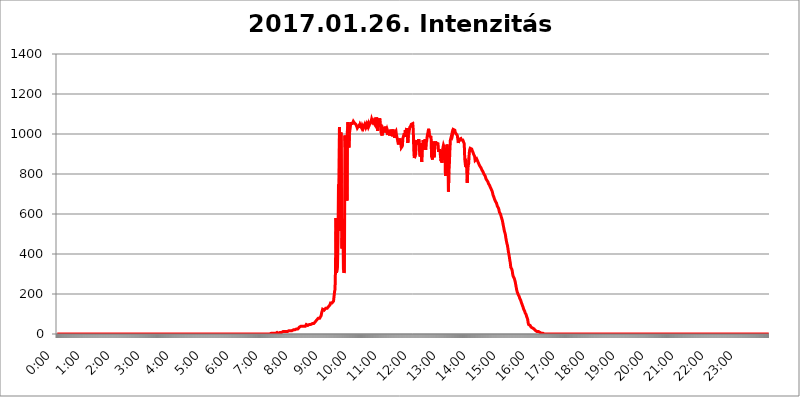
| Category | 2017.01.26. Intenzitás [W/m^2] |
|---|---|
| 0.0 | 0 |
| 0.0006944444444444445 | 0 |
| 0.001388888888888889 | 0 |
| 0.0020833333333333333 | 0 |
| 0.002777777777777778 | 0 |
| 0.003472222222222222 | 0 |
| 0.004166666666666667 | 0 |
| 0.004861111111111111 | 0 |
| 0.005555555555555556 | 0 |
| 0.0062499999999999995 | 0 |
| 0.006944444444444444 | 0 |
| 0.007638888888888889 | 0 |
| 0.008333333333333333 | 0 |
| 0.009027777777777779 | 0 |
| 0.009722222222222222 | 0 |
| 0.010416666666666666 | 0 |
| 0.011111111111111112 | 0 |
| 0.011805555555555555 | 0 |
| 0.012499999999999999 | 0 |
| 0.013194444444444444 | 0 |
| 0.013888888888888888 | 0 |
| 0.014583333333333332 | 0 |
| 0.015277777777777777 | 0 |
| 0.015972222222222224 | 0 |
| 0.016666666666666666 | 0 |
| 0.017361111111111112 | 0 |
| 0.018055555555555557 | 0 |
| 0.01875 | 0 |
| 0.019444444444444445 | 0 |
| 0.02013888888888889 | 0 |
| 0.020833333333333332 | 0 |
| 0.02152777777777778 | 0 |
| 0.022222222222222223 | 0 |
| 0.02291666666666667 | 0 |
| 0.02361111111111111 | 0 |
| 0.024305555555555556 | 0 |
| 0.024999999999999998 | 0 |
| 0.025694444444444447 | 0 |
| 0.02638888888888889 | 0 |
| 0.027083333333333334 | 0 |
| 0.027777777777777776 | 0 |
| 0.02847222222222222 | 0 |
| 0.029166666666666664 | 0 |
| 0.029861111111111113 | 0 |
| 0.030555555555555555 | 0 |
| 0.03125 | 0 |
| 0.03194444444444445 | 0 |
| 0.03263888888888889 | 0 |
| 0.03333333333333333 | 0 |
| 0.034027777777777775 | 0 |
| 0.034722222222222224 | 0 |
| 0.035416666666666666 | 0 |
| 0.036111111111111115 | 0 |
| 0.03680555555555556 | 0 |
| 0.0375 | 0 |
| 0.03819444444444444 | 0 |
| 0.03888888888888889 | 0 |
| 0.03958333333333333 | 0 |
| 0.04027777777777778 | 0 |
| 0.04097222222222222 | 0 |
| 0.041666666666666664 | 0 |
| 0.042361111111111106 | 0 |
| 0.04305555555555556 | 0 |
| 0.043750000000000004 | 0 |
| 0.044444444444444446 | 0 |
| 0.04513888888888889 | 0 |
| 0.04583333333333334 | 0 |
| 0.04652777777777778 | 0 |
| 0.04722222222222222 | 0 |
| 0.04791666666666666 | 0 |
| 0.04861111111111111 | 0 |
| 0.049305555555555554 | 0 |
| 0.049999999999999996 | 0 |
| 0.05069444444444445 | 0 |
| 0.051388888888888894 | 0 |
| 0.052083333333333336 | 0 |
| 0.05277777777777778 | 0 |
| 0.05347222222222222 | 0 |
| 0.05416666666666667 | 0 |
| 0.05486111111111111 | 0 |
| 0.05555555555555555 | 0 |
| 0.05625 | 0 |
| 0.05694444444444444 | 0 |
| 0.057638888888888885 | 0 |
| 0.05833333333333333 | 0 |
| 0.05902777777777778 | 0 |
| 0.059722222222222225 | 0 |
| 0.06041666666666667 | 0 |
| 0.061111111111111116 | 0 |
| 0.06180555555555556 | 0 |
| 0.0625 | 0 |
| 0.06319444444444444 | 0 |
| 0.06388888888888888 | 0 |
| 0.06458333333333334 | 0 |
| 0.06527777777777778 | 0 |
| 0.06597222222222222 | 0 |
| 0.06666666666666667 | 0 |
| 0.06736111111111111 | 0 |
| 0.06805555555555555 | 0 |
| 0.06874999999999999 | 0 |
| 0.06944444444444443 | 0 |
| 0.07013888888888889 | 0 |
| 0.07083333333333333 | 0 |
| 0.07152777777777779 | 0 |
| 0.07222222222222223 | 0 |
| 0.07291666666666667 | 0 |
| 0.07361111111111111 | 0 |
| 0.07430555555555556 | 0 |
| 0.075 | 0 |
| 0.07569444444444444 | 0 |
| 0.0763888888888889 | 0 |
| 0.07708333333333334 | 0 |
| 0.07777777777777778 | 0 |
| 0.07847222222222222 | 0 |
| 0.07916666666666666 | 0 |
| 0.0798611111111111 | 0 |
| 0.08055555555555556 | 0 |
| 0.08125 | 0 |
| 0.08194444444444444 | 0 |
| 0.08263888888888889 | 0 |
| 0.08333333333333333 | 0 |
| 0.08402777777777777 | 0 |
| 0.08472222222222221 | 0 |
| 0.08541666666666665 | 0 |
| 0.08611111111111112 | 0 |
| 0.08680555555555557 | 0 |
| 0.08750000000000001 | 0 |
| 0.08819444444444445 | 0 |
| 0.08888888888888889 | 0 |
| 0.08958333333333333 | 0 |
| 0.09027777777777778 | 0 |
| 0.09097222222222222 | 0 |
| 0.09166666666666667 | 0 |
| 0.09236111111111112 | 0 |
| 0.09305555555555556 | 0 |
| 0.09375 | 0 |
| 0.09444444444444444 | 0 |
| 0.09513888888888888 | 0 |
| 0.09583333333333333 | 0 |
| 0.09652777777777777 | 0 |
| 0.09722222222222222 | 0 |
| 0.09791666666666667 | 0 |
| 0.09861111111111111 | 0 |
| 0.09930555555555555 | 0 |
| 0.09999999999999999 | 0 |
| 0.10069444444444443 | 0 |
| 0.1013888888888889 | 0 |
| 0.10208333333333335 | 0 |
| 0.10277777777777779 | 0 |
| 0.10347222222222223 | 0 |
| 0.10416666666666667 | 0 |
| 0.10486111111111111 | 0 |
| 0.10555555555555556 | 0 |
| 0.10625 | 0 |
| 0.10694444444444444 | 0 |
| 0.1076388888888889 | 0 |
| 0.10833333333333334 | 0 |
| 0.10902777777777778 | 0 |
| 0.10972222222222222 | 0 |
| 0.1111111111111111 | 0 |
| 0.11180555555555556 | 0 |
| 0.11180555555555556 | 0 |
| 0.1125 | 0 |
| 0.11319444444444444 | 0 |
| 0.11388888888888889 | 0 |
| 0.11458333333333333 | 0 |
| 0.11527777777777777 | 0 |
| 0.11597222222222221 | 0 |
| 0.11666666666666665 | 0 |
| 0.1173611111111111 | 0 |
| 0.11805555555555557 | 0 |
| 0.11944444444444445 | 0 |
| 0.12013888888888889 | 0 |
| 0.12083333333333333 | 0 |
| 0.12152777777777778 | 0 |
| 0.12222222222222223 | 0 |
| 0.12291666666666667 | 0 |
| 0.12291666666666667 | 0 |
| 0.12361111111111112 | 0 |
| 0.12430555555555556 | 0 |
| 0.125 | 0 |
| 0.12569444444444444 | 0 |
| 0.12638888888888888 | 0 |
| 0.12708333333333333 | 0 |
| 0.16875 | 0 |
| 0.12847222222222224 | 0 |
| 0.12916666666666668 | 0 |
| 0.12986111111111112 | 0 |
| 0.13055555555555556 | 0 |
| 0.13125 | 0 |
| 0.13194444444444445 | 0 |
| 0.1326388888888889 | 0 |
| 0.13333333333333333 | 0 |
| 0.13402777777777777 | 0 |
| 0.13402777777777777 | 0 |
| 0.13472222222222222 | 0 |
| 0.13541666666666666 | 0 |
| 0.1361111111111111 | 0 |
| 0.13749999999999998 | 0 |
| 0.13819444444444443 | 0 |
| 0.1388888888888889 | 0 |
| 0.13958333333333334 | 0 |
| 0.14027777777777778 | 0 |
| 0.14097222222222222 | 0 |
| 0.14166666666666666 | 0 |
| 0.1423611111111111 | 0 |
| 0.14305555555555557 | 0 |
| 0.14375000000000002 | 0 |
| 0.14444444444444446 | 0 |
| 0.1451388888888889 | 0 |
| 0.1451388888888889 | 0 |
| 0.14652777777777778 | 0 |
| 0.14722222222222223 | 0 |
| 0.14791666666666667 | 0 |
| 0.1486111111111111 | 0 |
| 0.14930555555555555 | 0 |
| 0.15 | 0 |
| 0.15069444444444444 | 0 |
| 0.15138888888888888 | 0 |
| 0.15208333333333332 | 0 |
| 0.15277777777777776 | 0 |
| 0.15347222222222223 | 0 |
| 0.15416666666666667 | 0 |
| 0.15486111111111112 | 0 |
| 0.15555555555555556 | 0 |
| 0.15625 | 0 |
| 0.15694444444444444 | 0 |
| 0.15763888888888888 | 0 |
| 0.15833333333333333 | 0 |
| 0.15902777777777777 | 0 |
| 0.15972222222222224 | 0 |
| 0.16041666666666668 | 0 |
| 0.16111111111111112 | 0 |
| 0.16180555555555556 | 0 |
| 0.1625 | 0 |
| 0.16319444444444445 | 0 |
| 0.1638888888888889 | 0 |
| 0.16458333333333333 | 0 |
| 0.16527777777777777 | 0 |
| 0.16597222222222222 | 0 |
| 0.16666666666666666 | 0 |
| 0.1673611111111111 | 0 |
| 0.16805555555555554 | 0 |
| 0.16874999999999998 | 0 |
| 0.16944444444444443 | 0 |
| 0.17013888888888887 | 0 |
| 0.1708333333333333 | 0 |
| 0.17152777777777775 | 0 |
| 0.17222222222222225 | 0 |
| 0.1729166666666667 | 0 |
| 0.17361111111111113 | 0 |
| 0.17430555555555557 | 0 |
| 0.17500000000000002 | 0 |
| 0.17569444444444446 | 0 |
| 0.1763888888888889 | 0 |
| 0.17708333333333334 | 0 |
| 0.17777777777777778 | 0 |
| 0.17847222222222223 | 0 |
| 0.17916666666666667 | 0 |
| 0.1798611111111111 | 0 |
| 0.18055555555555555 | 0 |
| 0.18125 | 0 |
| 0.18194444444444444 | 0 |
| 0.1826388888888889 | 0 |
| 0.18333333333333335 | 0 |
| 0.1840277777777778 | 0 |
| 0.18472222222222223 | 0 |
| 0.18541666666666667 | 0 |
| 0.18611111111111112 | 0 |
| 0.18680555555555556 | 0 |
| 0.1875 | 0 |
| 0.18819444444444444 | 0 |
| 0.18888888888888888 | 0 |
| 0.18958333333333333 | 0 |
| 0.19027777777777777 | 0 |
| 0.1909722222222222 | 0 |
| 0.19166666666666665 | 0 |
| 0.19236111111111112 | 0 |
| 0.19305555555555554 | 0 |
| 0.19375 | 0 |
| 0.19444444444444445 | 0 |
| 0.1951388888888889 | 0 |
| 0.19583333333333333 | 0 |
| 0.19652777777777777 | 0 |
| 0.19722222222222222 | 0 |
| 0.19791666666666666 | 0 |
| 0.1986111111111111 | 0 |
| 0.19930555555555554 | 0 |
| 0.19999999999999998 | 0 |
| 0.20069444444444443 | 0 |
| 0.20138888888888887 | 0 |
| 0.2020833333333333 | 0 |
| 0.2027777777777778 | 0 |
| 0.2034722222222222 | 0 |
| 0.2041666666666667 | 0 |
| 0.20486111111111113 | 0 |
| 0.20555555555555557 | 0 |
| 0.20625000000000002 | 0 |
| 0.20694444444444446 | 0 |
| 0.2076388888888889 | 0 |
| 0.20833333333333334 | 0 |
| 0.20902777777777778 | 0 |
| 0.20972222222222223 | 0 |
| 0.21041666666666667 | 0 |
| 0.2111111111111111 | 0 |
| 0.21180555555555555 | 0 |
| 0.2125 | 0 |
| 0.21319444444444444 | 0 |
| 0.2138888888888889 | 0 |
| 0.21458333333333335 | 0 |
| 0.2152777777777778 | 0 |
| 0.21597222222222223 | 0 |
| 0.21666666666666667 | 0 |
| 0.21736111111111112 | 0 |
| 0.21805555555555556 | 0 |
| 0.21875 | 0 |
| 0.21944444444444444 | 0 |
| 0.22013888888888888 | 0 |
| 0.22083333333333333 | 0 |
| 0.22152777777777777 | 0 |
| 0.2222222222222222 | 0 |
| 0.22291666666666665 | 0 |
| 0.2236111111111111 | 0 |
| 0.22430555555555556 | 0 |
| 0.225 | 0 |
| 0.22569444444444445 | 0 |
| 0.2263888888888889 | 0 |
| 0.22708333333333333 | 0 |
| 0.22777777777777777 | 0 |
| 0.22847222222222222 | 0 |
| 0.22916666666666666 | 0 |
| 0.2298611111111111 | 0 |
| 0.23055555555555554 | 0 |
| 0.23124999999999998 | 0 |
| 0.23194444444444443 | 0 |
| 0.23263888888888887 | 0 |
| 0.2333333333333333 | 0 |
| 0.2340277777777778 | 0 |
| 0.2347222222222222 | 0 |
| 0.2354166666666667 | 0 |
| 0.23611111111111113 | 0 |
| 0.23680555555555557 | 0 |
| 0.23750000000000002 | 0 |
| 0.23819444444444446 | 0 |
| 0.2388888888888889 | 0 |
| 0.23958333333333334 | 0 |
| 0.24027777777777778 | 0 |
| 0.24097222222222223 | 0 |
| 0.24166666666666667 | 0 |
| 0.2423611111111111 | 0 |
| 0.24305555555555555 | 0 |
| 0.24375 | 0 |
| 0.24444444444444446 | 0 |
| 0.24513888888888888 | 0 |
| 0.24583333333333335 | 0 |
| 0.2465277777777778 | 0 |
| 0.24722222222222223 | 0 |
| 0.24791666666666667 | 0 |
| 0.24861111111111112 | 0 |
| 0.24930555555555556 | 0 |
| 0.25 | 0 |
| 0.25069444444444444 | 0 |
| 0.2513888888888889 | 0 |
| 0.2520833333333333 | 0 |
| 0.25277777777777777 | 0 |
| 0.2534722222222222 | 0 |
| 0.25416666666666665 | 0 |
| 0.2548611111111111 | 0 |
| 0.2555555555555556 | 0 |
| 0.25625000000000003 | 0 |
| 0.2569444444444445 | 0 |
| 0.2576388888888889 | 0 |
| 0.25833333333333336 | 0 |
| 0.2590277777777778 | 0 |
| 0.25972222222222224 | 0 |
| 0.2604166666666667 | 0 |
| 0.2611111111111111 | 0 |
| 0.26180555555555557 | 0 |
| 0.2625 | 0 |
| 0.26319444444444445 | 0 |
| 0.2638888888888889 | 0 |
| 0.26458333333333334 | 0 |
| 0.2652777777777778 | 0 |
| 0.2659722222222222 | 0 |
| 0.26666666666666666 | 0 |
| 0.2673611111111111 | 0 |
| 0.26805555555555555 | 0 |
| 0.26875 | 0 |
| 0.26944444444444443 | 0 |
| 0.2701388888888889 | 0 |
| 0.2708333333333333 | 0 |
| 0.27152777777777776 | 0 |
| 0.2722222222222222 | 0 |
| 0.27291666666666664 | 0 |
| 0.2736111111111111 | 0 |
| 0.2743055555555555 | 0 |
| 0.27499999999999997 | 0 |
| 0.27569444444444446 | 0 |
| 0.27638888888888885 | 0 |
| 0.27708333333333335 | 0 |
| 0.2777777777777778 | 0 |
| 0.27847222222222223 | 0 |
| 0.2791666666666667 | 0 |
| 0.2798611111111111 | 0 |
| 0.28055555555555556 | 0 |
| 0.28125 | 0 |
| 0.28194444444444444 | 0 |
| 0.2826388888888889 | 0 |
| 0.2833333333333333 | 0 |
| 0.28402777777777777 | 0 |
| 0.2847222222222222 | 0 |
| 0.28541666666666665 | 0 |
| 0.28611111111111115 | 0 |
| 0.28680555555555554 | 0 |
| 0.28750000000000003 | 0 |
| 0.2881944444444445 | 0 |
| 0.2888888888888889 | 0 |
| 0.28958333333333336 | 0 |
| 0.2902777777777778 | 0 |
| 0.29097222222222224 | 0 |
| 0.2916666666666667 | 0 |
| 0.2923611111111111 | 0 |
| 0.29305555555555557 | 0 |
| 0.29375 | 0 |
| 0.29444444444444445 | 0 |
| 0.2951388888888889 | 0 |
| 0.29583333333333334 | 0 |
| 0.2965277777777778 | 0 |
| 0.2972222222222222 | 0 |
| 0.29791666666666666 | 0 |
| 0.2986111111111111 | 0 |
| 0.29930555555555555 | 0 |
| 0.3 | 3.525 |
| 0.30069444444444443 | 0 |
| 0.3013888888888889 | 3.525 |
| 0.3020833333333333 | 3.525 |
| 0.30277777777777776 | 3.525 |
| 0.3034722222222222 | 3.525 |
| 0.30416666666666664 | 3.525 |
| 0.3048611111111111 | 3.525 |
| 0.3055555555555555 | 3.525 |
| 0.30624999999999997 | 3.525 |
| 0.3069444444444444 | 3.525 |
| 0.3076388888888889 | 3.525 |
| 0.30833333333333335 | 7.887 |
| 0.3090277777777778 | 7.887 |
| 0.30972222222222223 | 3.525 |
| 0.3104166666666667 | 3.525 |
| 0.3111111111111111 | 7.887 |
| 0.31180555555555556 | 7.887 |
| 0.3125 | 7.887 |
| 0.31319444444444444 | 7.887 |
| 0.3138888888888889 | 7.887 |
| 0.3145833333333333 | 7.887 |
| 0.31527777777777777 | 12.257 |
| 0.3159722222222222 | 12.257 |
| 0.31666666666666665 | 12.257 |
| 0.31736111111111115 | 12.257 |
| 0.31805555555555554 | 12.257 |
| 0.31875000000000003 | 12.257 |
| 0.3194444444444445 | 12.257 |
| 0.3201388888888889 | 12.257 |
| 0.32083333333333336 | 12.257 |
| 0.3215277777777778 | 12.257 |
| 0.32222222222222224 | 12.257 |
| 0.3229166666666667 | 12.257 |
| 0.3236111111111111 | 12.257 |
| 0.32430555555555557 | 12.257 |
| 0.325 | 16.636 |
| 0.32569444444444445 | 16.636 |
| 0.3263888888888889 | 16.636 |
| 0.32708333333333334 | 16.636 |
| 0.3277777777777778 | 16.636 |
| 0.3284722222222222 | 16.636 |
| 0.32916666666666666 | 16.636 |
| 0.3298611111111111 | 16.636 |
| 0.33055555555555555 | 21.024 |
| 0.33125 | 21.024 |
| 0.33194444444444443 | 21.024 |
| 0.3326388888888889 | 21.024 |
| 0.3333333333333333 | 21.024 |
| 0.3340277777777778 | 21.024 |
| 0.3347222222222222 | 21.024 |
| 0.3354166666666667 | 25.419 |
| 0.3361111111111111 | 25.419 |
| 0.3368055555555556 | 25.419 |
| 0.33749999999999997 | 25.419 |
| 0.33819444444444446 | 29.823 |
| 0.33888888888888885 | 29.823 |
| 0.33958333333333335 | 34.234 |
| 0.34027777777777773 | 34.234 |
| 0.34097222222222223 | 38.653 |
| 0.3416666666666666 | 38.653 |
| 0.3423611111111111 | 38.653 |
| 0.3430555555555555 | 38.653 |
| 0.34375 | 38.653 |
| 0.3444444444444445 | 38.653 |
| 0.3451388888888889 | 38.653 |
| 0.3458333333333334 | 38.653 |
| 0.34652777777777777 | 38.653 |
| 0.34722222222222227 | 38.653 |
| 0.34791666666666665 | 38.653 |
| 0.34861111111111115 | 43.079 |
| 0.34930555555555554 | 47.511 |
| 0.35000000000000003 | 47.511 |
| 0.3506944444444444 | 43.079 |
| 0.3513888888888889 | 43.079 |
| 0.3520833333333333 | 43.079 |
| 0.3527777777777778 | 47.511 |
| 0.3534722222222222 | 47.511 |
| 0.3541666666666667 | 47.511 |
| 0.3548611111111111 | 47.511 |
| 0.35555555555555557 | 47.511 |
| 0.35625 | 51.951 |
| 0.35694444444444445 | 51.951 |
| 0.3576388888888889 | 51.951 |
| 0.35833333333333334 | 51.951 |
| 0.3590277777777778 | 51.951 |
| 0.3597222222222222 | 51.951 |
| 0.36041666666666666 | 56.398 |
| 0.3611111111111111 | 56.398 |
| 0.36180555555555555 | 60.85 |
| 0.3625 | 60.85 |
| 0.36319444444444443 | 65.31 |
| 0.3638888888888889 | 69.775 |
| 0.3645833333333333 | 74.246 |
| 0.3652777777777778 | 74.246 |
| 0.3659722222222222 | 78.722 |
| 0.3666666666666667 | 83.205 |
| 0.3673611111111111 | 83.205 |
| 0.3680555555555556 | 78.722 |
| 0.36874999999999997 | 83.205 |
| 0.36944444444444446 | 83.205 |
| 0.37013888888888885 | 92.184 |
| 0.37083333333333335 | 105.69 |
| 0.37152777777777773 | 114.716 |
| 0.37222222222222223 | 123.758 |
| 0.3729166666666666 | 128.284 |
| 0.3736111111111111 | 123.758 |
| 0.3743055555555555 | 119.235 |
| 0.375 | 119.235 |
| 0.3756944444444445 | 123.758 |
| 0.3763888888888889 | 128.284 |
| 0.3770833333333334 | 128.284 |
| 0.37777777777777777 | 128.284 |
| 0.37847222222222227 | 128.284 |
| 0.37916666666666665 | 123.758 |
| 0.37986111111111115 | 128.284 |
| 0.38055555555555554 | 137.347 |
| 0.38125000000000003 | 141.884 |
| 0.3819444444444444 | 141.884 |
| 0.3826388888888889 | 146.423 |
| 0.3833333333333333 | 155.509 |
| 0.3840277777777778 | 155.509 |
| 0.3847222222222222 | 155.509 |
| 0.3854166666666667 | 155.509 |
| 0.3861111111111111 | 155.509 |
| 0.38680555555555557 | 160.056 |
| 0.3875 | 164.605 |
| 0.38819444444444445 | 187.378 |
| 0.3888888888888889 | 210.182 |
| 0.38958333333333334 | 223.873 |
| 0.3902777777777778 | 324.052 |
| 0.3909722222222222 | 579.542 |
| 0.39166666666666666 | 305.898 |
| 0.3923611111111111 | 310.44 |
| 0.39305555555555555 | 342.162 |
| 0.39375 | 462.786 |
| 0.39444444444444443 | 747.834 |
| 0.3951388888888889 | 634.105 |
| 0.3958333333333333 | 1033.537 |
| 0.3965277777777778 | 515.223 |
| 0.3972222222222222 | 545.416 |
| 0.3979166666666667 | 1007.383 |
| 0.3986111111111111 | 751.803 |
| 0.3993055555555556 | 427.39 |
| 0.39999999999999997 | 575.299 |
| 0.40069444444444446 | 536.82 |
| 0.40138888888888885 | 324.052 |
| 0.40208333333333335 | 305.898 |
| 0.40277777777777773 | 314.98 |
| 0.40347222222222223 | 992.448 |
| 0.4041666666666666 | 928.819 |
| 0.4048611111111111 | 917.534 |
| 0.4055555555555555 | 970.034 |
| 0.40625 | 667.123 |
| 0.4069444444444445 | 1014.852 |
| 0.4076388888888889 | 1059.756 |
| 0.4083333333333334 | 1029.798 |
| 0.40902777777777777 | 932.576 |
| 0.40972222222222227 | 999.916 |
| 0.41041666666666665 | 1018.587 |
| 0.41111111111111115 | 1037.277 |
| 0.41180555555555554 | 1052.255 |
| 0.41250000000000003 | 1052.255 |
| 0.4131944444444444 | 1052.255 |
| 0.4138888888888889 | 1052.255 |
| 0.4145833333333333 | 1056.004 |
| 0.4152777777777778 | 1063.51 |
| 0.4159722222222222 | 1067.267 |
| 0.4166666666666667 | 1056.004 |
| 0.4173611111111111 | 1052.255 |
| 0.41805555555555557 | 1052.255 |
| 0.41875 | 1048.508 |
| 0.41944444444444445 | 1044.762 |
| 0.4201388888888889 | 1037.277 |
| 0.42083333333333334 | 1029.798 |
| 0.4215277777777778 | 1033.537 |
| 0.4222222222222222 | 1037.277 |
| 0.42291666666666666 | 1041.019 |
| 0.4236111111111111 | 1044.762 |
| 0.42430555555555555 | 1029.798 |
| 0.425 | 1044.762 |
| 0.42569444444444443 | 1048.508 |
| 0.4263888888888889 | 1044.762 |
| 0.4270833333333333 | 1029.798 |
| 0.4277777777777778 | 1041.019 |
| 0.4284722222222222 | 1037.277 |
| 0.4291666666666667 | 1029.798 |
| 0.4298611111111111 | 1037.277 |
| 0.4305555555555556 | 1041.019 |
| 0.43124999999999997 | 1048.508 |
| 0.43194444444444446 | 1044.762 |
| 0.43263888888888885 | 1033.537 |
| 0.43333333333333335 | 1033.537 |
| 0.43402777777777773 | 1048.508 |
| 0.43472222222222223 | 1041.019 |
| 0.4354166666666666 | 1041.019 |
| 0.4361111111111111 | 1052.255 |
| 0.4368055555555555 | 1037.277 |
| 0.4375 | 1037.277 |
| 0.4381944444444445 | 1048.508 |
| 0.4388888888888889 | 1044.762 |
| 0.4395833333333334 | 1044.762 |
| 0.44027777777777777 | 1063.51 |
| 0.44097222222222227 | 1074.789 |
| 0.44166666666666665 | 1074.789 |
| 0.44236111111111115 | 1059.756 |
| 0.44305555555555554 | 1059.756 |
| 0.44375000000000003 | 1067.267 |
| 0.4444444444444444 | 1052.255 |
| 0.4451388888888889 | 1052.255 |
| 0.4458333333333333 | 1044.762 |
| 0.4465277777777778 | 1078.555 |
| 0.4472222222222222 | 1044.762 |
| 0.4479166666666667 | 1082.324 |
| 0.4486111111111111 | 1056.004 |
| 0.44930555555555557 | 1014.852 |
| 0.45 | 1056.004 |
| 0.45069444444444445 | 1044.762 |
| 0.4513888888888889 | 1063.51 |
| 0.45208333333333334 | 1078.555 |
| 0.4527777777777778 | 1067.267 |
| 0.4534722222222222 | 1037.277 |
| 0.45416666666666666 | 1007.383 |
| 0.4548611111111111 | 1007.383 |
| 0.45555555555555555 | 992.448 |
| 0.45625 | 1011.118 |
| 0.45694444444444443 | 1026.06 |
| 0.4576388888888889 | 1022.323 |
| 0.4583333333333333 | 1014.852 |
| 0.4590277777777778 | 1007.383 |
| 0.4597222222222222 | 1026.06 |
| 0.4604166666666667 | 1037.277 |
| 0.4611111111111111 | 1033.537 |
| 0.4618055555555556 | 1018.587 |
| 0.46249999999999997 | 1026.06 |
| 0.46319444444444446 | 1018.587 |
| 0.46388888888888885 | 996.182 |
| 0.46458333333333335 | 1014.852 |
| 0.46527777777777773 | 1003.65 |
| 0.46597222222222223 | 992.448 |
| 0.4666666666666666 | 996.182 |
| 0.4673611111111111 | 1014.852 |
| 0.4680555555555555 | 1022.323 |
| 0.46875 | 1007.383 |
| 0.4694444444444445 | 1007.383 |
| 0.4701388888888889 | 988.714 |
| 0.4708333333333334 | 1022.323 |
| 0.47152777777777777 | 999.916 |
| 0.47222222222222227 | 1011.118 |
| 0.47291666666666665 | 981.244 |
| 0.47361111111111115 | 1007.383 |
| 0.47430555555555554 | 1011.118 |
| 0.47500000000000003 | 1014.852 |
| 0.4756944444444444 | 996.182 |
| 0.4763888888888889 | 999.916 |
| 0.4770833333333333 | 973.772 |
| 0.4777777777777778 | 970.034 |
| 0.4784722222222222 | 947.58 |
| 0.4791666666666667 | 970.034 |
| 0.4798611111111111 | 962.555 |
| 0.48055555555555557 | 977.508 |
| 0.48125 | 955.071 |
| 0.48194444444444445 | 962.555 |
| 0.4826388888888889 | 932.576 |
| 0.48333333333333334 | 936.33 |
| 0.4840277777777778 | 940.082 |
| 0.4847222222222222 | 977.508 |
| 0.48541666666666666 | 977.508 |
| 0.4861111111111111 | 973.772 |
| 0.48680555555555555 | 1003.65 |
| 0.4875 | 984.98 |
| 0.48819444444444443 | 1018.587 |
| 0.4888888888888889 | 1007.383 |
| 0.4895833333333333 | 1007.383 |
| 0.4902777777777778 | 1029.798 |
| 0.4909722222222222 | 1011.118 |
| 0.4916666666666667 | 955.071 |
| 0.4923611111111111 | 996.182 |
| 0.4930555555555556 | 1003.65 |
| 0.49374999999999997 | 1018.587 |
| 0.49444444444444446 | 1033.537 |
| 0.49513888888888885 | 1037.277 |
| 0.49583333333333335 | 1041.019 |
| 0.49652777777777773 | 1048.508 |
| 0.49722222222222223 | 1052.255 |
| 0.4979166666666666 | 1052.255 |
| 0.4986111111111111 | 1052.255 |
| 0.4993055555555555 | 1022.323 |
| 0.5 | 925.06 |
| 0.5006944444444444 | 879.719 |
| 0.5013888888888889 | 883.516 |
| 0.5020833333333333 | 891.099 |
| 0.5027777777777778 | 898.668 |
| 0.5034722222222222 | 955.071 |
| 0.5041666666666667 | 970.034 |
| 0.5048611111111111 | 955.071 |
| 0.5055555555555555 | 947.58 |
| 0.50625 | 943.832 |
| 0.5069444444444444 | 973.772 |
| 0.5076388888888889 | 958.814 |
| 0.5083333333333333 | 902.447 |
| 0.5090277777777777 | 887.309 |
| 0.5097222222222222 | 955.071 |
| 0.5104166666666666 | 928.819 |
| 0.5111111111111112 | 860.676 |
| 0.5118055555555555 | 917.534 |
| 0.5125000000000001 | 925.06 |
| 0.5131944444444444 | 970.034 |
| 0.513888888888889 | 955.071 |
| 0.5145833333333333 | 943.832 |
| 0.5152777777777778 | 958.814 |
| 0.5159722222222222 | 973.772 |
| 0.5166666666666667 | 921.298 |
| 0.517361111111111 | 955.071 |
| 0.5180555555555556 | 962.555 |
| 0.5187499999999999 | 984.98 |
| 0.5194444444444445 | 999.916 |
| 0.5201388888888888 | 1011.118 |
| 0.5208333333333334 | 1026.06 |
| 0.5215277777777778 | 1026.06 |
| 0.5222222222222223 | 988.714 |
| 0.5229166666666667 | 992.448 |
| 0.5236111111111111 | 988.714 |
| 0.5243055555555556 | 984.98 |
| 0.525 | 887.309 |
| 0.5256944444444445 | 887.309 |
| 0.5263888888888889 | 872.114 |
| 0.5270833333333333 | 955.071 |
| 0.5277777777777778 | 962.555 |
| 0.5284722222222222 | 883.516 |
| 0.5291666666666667 | 887.309 |
| 0.5298611111111111 | 951.327 |
| 0.5305555555555556 | 962.555 |
| 0.53125 | 947.58 |
| 0.5319444444444444 | 955.071 |
| 0.5326388888888889 | 958.814 |
| 0.5333333333333333 | 958.814 |
| 0.5340277777777778 | 951.327 |
| 0.5347222222222222 | 917.534 |
| 0.5354166666666667 | 921.298 |
| 0.5361111111111111 | 921.298 |
| 0.5368055555555555 | 917.534 |
| 0.5375 | 887.309 |
| 0.5381944444444444 | 864.493 |
| 0.5388888888888889 | 875.918 |
| 0.5395833333333333 | 856.855 |
| 0.5402777777777777 | 913.766 |
| 0.5409722222222222 | 932.576 |
| 0.5416666666666666 | 943.832 |
| 0.5423611111111112 | 947.58 |
| 0.5430555555555555 | 928.819 |
| 0.5437500000000001 | 917.534 |
| 0.5444444444444444 | 791.169 |
| 0.545138888888889 | 894.885 |
| 0.5458333333333333 | 909.996 |
| 0.5465277777777778 | 947.58 |
| 0.5472222222222222 | 932.576 |
| 0.5479166666666667 | 917.534 |
| 0.548611111111111 | 711.832 |
| 0.5493055555555556 | 806.757 |
| 0.5499999999999999 | 853.029 |
| 0.5506944444444445 | 921.298 |
| 0.5513888888888888 | 970.034 |
| 0.5520833333333334 | 966.295 |
| 0.5527777777777778 | 988.714 |
| 0.5534722222222223 | 999.916 |
| 0.5541666666666667 | 992.448 |
| 0.5548611111111111 | 1003.65 |
| 0.5555555555555556 | 1022.323 |
| 0.55625 | 1022.323 |
| 0.5569444444444445 | 1022.323 |
| 0.5576388888888889 | 1018.587 |
| 0.5583333333333333 | 1007.383 |
| 0.5590277777777778 | 1003.65 |
| 0.5597222222222222 | 999.916 |
| 0.5604166666666667 | 996.182 |
| 0.5611111111111111 | 992.448 |
| 0.5618055555555556 | 988.714 |
| 0.5625 | 955.071 |
| 0.5631944444444444 | 966.295 |
| 0.5638888888888889 | 973.772 |
| 0.5645833333333333 | 970.034 |
| 0.5652777777777778 | 973.772 |
| 0.5659722222222222 | 977.508 |
| 0.5666666666666667 | 970.034 |
| 0.5673611111111111 | 970.034 |
| 0.5680555555555555 | 970.034 |
| 0.56875 | 970.034 |
| 0.5694444444444444 | 966.295 |
| 0.5701388888888889 | 970.034 |
| 0.5708333333333333 | 951.327 |
| 0.5715277777777777 | 875.918 |
| 0.5722222222222222 | 853.029 |
| 0.5729166666666666 | 856.855 |
| 0.5736111111111112 | 860.676 |
| 0.5743055555555555 | 822.26 |
| 0.5750000000000001 | 755.766 |
| 0.5756944444444444 | 806.757 |
| 0.576388888888889 | 841.526 |
| 0.5770833333333333 | 853.029 |
| 0.5777777777777778 | 902.447 |
| 0.5784722222222222 | 921.298 |
| 0.5791666666666667 | 928.819 |
| 0.579861111111111 | 925.06 |
| 0.5805555555555556 | 925.06 |
| 0.5812499999999999 | 925.06 |
| 0.5819444444444445 | 917.534 |
| 0.5826388888888888 | 917.534 |
| 0.5833333333333334 | 906.223 |
| 0.5840277777777778 | 898.668 |
| 0.5847222222222223 | 894.885 |
| 0.5854166666666667 | 887.309 |
| 0.5861111111111111 | 868.305 |
| 0.5868055555555556 | 864.493 |
| 0.5875 | 872.114 |
| 0.5881944444444445 | 875.918 |
| 0.5888888888888889 | 872.114 |
| 0.5895833333333333 | 864.493 |
| 0.5902777777777778 | 860.676 |
| 0.5909722222222222 | 853.029 |
| 0.5916666666666667 | 849.199 |
| 0.5923611111111111 | 841.526 |
| 0.5930555555555556 | 837.682 |
| 0.59375 | 837.682 |
| 0.5944444444444444 | 829.981 |
| 0.5951388888888889 | 826.123 |
| 0.5958333333333333 | 818.392 |
| 0.5965277777777778 | 814.519 |
| 0.5972222222222222 | 810.641 |
| 0.5979166666666667 | 802.868 |
| 0.5986111111111111 | 798.974 |
| 0.5993055555555555 | 802.868 |
| 0.6 | 791.169 |
| 0.6006944444444444 | 783.342 |
| 0.6013888888888889 | 775.492 |
| 0.6020833333333333 | 771.559 |
| 0.6027777777777777 | 767.62 |
| 0.6034722222222222 | 767.62 |
| 0.6041666666666666 | 759.723 |
| 0.6048611111111112 | 751.803 |
| 0.6055555555555555 | 751.803 |
| 0.6062500000000001 | 743.859 |
| 0.6069444444444444 | 739.877 |
| 0.607638888888889 | 731.896 |
| 0.6083333333333333 | 731.896 |
| 0.6090277777777778 | 727.896 |
| 0.6097222222222222 | 715.858 |
| 0.6104166666666667 | 707.8 |
| 0.611111111111111 | 695.666 |
| 0.6118055555555556 | 691.608 |
| 0.6124999999999999 | 683.473 |
| 0.6131944444444445 | 675.311 |
| 0.6138888888888888 | 671.22 |
| 0.6145833333333334 | 663.019 |
| 0.6152777777777778 | 658.909 |
| 0.6159722222222223 | 654.791 |
| 0.6166666666666667 | 646.537 |
| 0.6173611111111111 | 638.256 |
| 0.6180555555555556 | 634.105 |
| 0.61875 | 629.948 |
| 0.6194444444444445 | 621.613 |
| 0.6201388888888889 | 609.062 |
| 0.6208333333333333 | 604.864 |
| 0.6215277777777778 | 600.661 |
| 0.6222222222222222 | 592.233 |
| 0.6229166666666667 | 583.779 |
| 0.6236111111111111 | 575.299 |
| 0.6243055555555556 | 566.793 |
| 0.625 | 553.986 |
| 0.6256944444444444 | 541.121 |
| 0.6263888888888889 | 528.2 |
| 0.6270833333333333 | 515.223 |
| 0.6277777777777778 | 506.542 |
| 0.6284722222222222 | 497.836 |
| 0.6291666666666667 | 480.356 |
| 0.6298611111111111 | 467.187 |
| 0.6305555555555555 | 453.968 |
| 0.63125 | 445.129 |
| 0.6319444444444444 | 431.833 |
| 0.6326388888888889 | 414.035 |
| 0.6333333333333333 | 400.638 |
| 0.6340277777777777 | 387.202 |
| 0.6347222222222222 | 369.23 |
| 0.6354166666666666 | 355.712 |
| 0.6361111111111112 | 333.113 |
| 0.6368055555555555 | 328.584 |
| 0.6375000000000001 | 324.052 |
| 0.6381944444444444 | 314.98 |
| 0.638888888888889 | 296.808 |
| 0.6395833333333333 | 287.709 |
| 0.6402777777777778 | 283.156 |
| 0.6409722222222222 | 278.603 |
| 0.6416666666666667 | 269.49 |
| 0.642361111111111 | 260.373 |
| 0.6430555555555556 | 246.689 |
| 0.6437499999999999 | 233 |
| 0.6444444444444445 | 219.309 |
| 0.6451388888888888 | 210.182 |
| 0.6458333333333334 | 205.62 |
| 0.6465277777777778 | 196.497 |
| 0.6472222222222223 | 191.937 |
| 0.6479166666666667 | 187.378 |
| 0.6486111111111111 | 178.264 |
| 0.6493055555555556 | 173.709 |
| 0.65 | 169.156 |
| 0.6506944444444445 | 160.056 |
| 0.6513888888888889 | 155.509 |
| 0.6520833333333333 | 146.423 |
| 0.6527777777777778 | 141.884 |
| 0.6534722222222222 | 132.814 |
| 0.6541666666666667 | 123.758 |
| 0.6548611111111111 | 119.235 |
| 0.6555555555555556 | 114.716 |
| 0.65625 | 105.69 |
| 0.6569444444444444 | 101.184 |
| 0.6576388888888889 | 96.682 |
| 0.6583333333333333 | 87.692 |
| 0.6590277777777778 | 87.692 |
| 0.6597222222222222 | 74.246 |
| 0.6604166666666667 | 56.398 |
| 0.6611111111111111 | 47.511 |
| 0.6618055555555555 | 47.511 |
| 0.6625 | 47.511 |
| 0.6631944444444444 | 43.079 |
| 0.6638888888888889 | 38.653 |
| 0.6645833333333333 | 34.234 |
| 0.6652777777777777 | 34.234 |
| 0.6659722222222222 | 29.823 |
| 0.6666666666666666 | 29.823 |
| 0.6673611111111111 | 29.823 |
| 0.6680555555555556 | 25.419 |
| 0.6687500000000001 | 25.419 |
| 0.6694444444444444 | 21.024 |
| 0.6701388888888888 | 21.024 |
| 0.6708333333333334 | 16.636 |
| 0.6715277777777778 | 12.257 |
| 0.6722222222222222 | 12.257 |
| 0.6729166666666666 | 12.257 |
| 0.6736111111111112 | 12.257 |
| 0.6743055555555556 | 12.257 |
| 0.6749999999999999 | 12.257 |
| 0.6756944444444444 | 7.887 |
| 0.6763888888888889 | 7.887 |
| 0.6770833333333334 | 7.887 |
| 0.6777777777777777 | 3.525 |
| 0.6784722222222223 | 3.525 |
| 0.6791666666666667 | 3.525 |
| 0.6798611111111111 | 3.525 |
| 0.6805555555555555 | 3.525 |
| 0.68125 | 3.525 |
| 0.6819444444444445 | 3.525 |
| 0.6826388888888889 | 3.525 |
| 0.6833333333333332 | 0 |
| 0.6840277777777778 | 0 |
| 0.6847222222222222 | 0 |
| 0.6854166666666667 | 0 |
| 0.686111111111111 | 0 |
| 0.6868055555555556 | 0 |
| 0.6875 | 0 |
| 0.6881944444444444 | 0 |
| 0.688888888888889 | 0 |
| 0.6895833333333333 | 0 |
| 0.6902777777777778 | 0 |
| 0.6909722222222222 | 0 |
| 0.6916666666666668 | 0 |
| 0.6923611111111111 | 0 |
| 0.6930555555555555 | 0 |
| 0.69375 | 0 |
| 0.6944444444444445 | 0 |
| 0.6951388888888889 | 0 |
| 0.6958333333333333 | 0 |
| 0.6965277777777777 | 0 |
| 0.6972222222222223 | 0 |
| 0.6979166666666666 | 0 |
| 0.6986111111111111 | 0 |
| 0.6993055555555556 | 0 |
| 0.7000000000000001 | 0 |
| 0.7006944444444444 | 0 |
| 0.7013888888888888 | 0 |
| 0.7020833333333334 | 0 |
| 0.7027777777777778 | 0 |
| 0.7034722222222222 | 0 |
| 0.7041666666666666 | 0 |
| 0.7048611111111112 | 0 |
| 0.7055555555555556 | 0 |
| 0.7062499999999999 | 0 |
| 0.7069444444444444 | 0 |
| 0.7076388888888889 | 0 |
| 0.7083333333333334 | 0 |
| 0.7090277777777777 | 0 |
| 0.7097222222222223 | 0 |
| 0.7104166666666667 | 0 |
| 0.7111111111111111 | 0 |
| 0.7118055555555555 | 0 |
| 0.7125 | 0 |
| 0.7131944444444445 | 0 |
| 0.7138888888888889 | 0 |
| 0.7145833333333332 | 0 |
| 0.7152777777777778 | 0 |
| 0.7159722222222222 | 0 |
| 0.7166666666666667 | 0 |
| 0.717361111111111 | 0 |
| 0.7180555555555556 | 0 |
| 0.71875 | 0 |
| 0.7194444444444444 | 0 |
| 0.720138888888889 | 0 |
| 0.7208333333333333 | 0 |
| 0.7215277777777778 | 0 |
| 0.7222222222222222 | 0 |
| 0.7229166666666668 | 0 |
| 0.7236111111111111 | 0 |
| 0.7243055555555555 | 0 |
| 0.725 | 0 |
| 0.7256944444444445 | 0 |
| 0.7263888888888889 | 0 |
| 0.7270833333333333 | 0 |
| 0.7277777777777777 | 0 |
| 0.7284722222222223 | 0 |
| 0.7291666666666666 | 0 |
| 0.7298611111111111 | 0 |
| 0.7305555555555556 | 0 |
| 0.7312500000000001 | 0 |
| 0.7319444444444444 | 0 |
| 0.7326388888888888 | 0 |
| 0.7333333333333334 | 0 |
| 0.7340277777777778 | 0 |
| 0.7347222222222222 | 0 |
| 0.7354166666666666 | 0 |
| 0.7361111111111112 | 0 |
| 0.7368055555555556 | 0 |
| 0.7374999999999999 | 0 |
| 0.7381944444444444 | 0 |
| 0.7388888888888889 | 0 |
| 0.7395833333333334 | 0 |
| 0.7402777777777777 | 0 |
| 0.7409722222222223 | 0 |
| 0.7416666666666667 | 0 |
| 0.7423611111111111 | 0 |
| 0.7430555555555555 | 0 |
| 0.74375 | 0 |
| 0.7444444444444445 | 0 |
| 0.7451388888888889 | 0 |
| 0.7458333333333332 | 0 |
| 0.7465277777777778 | 0 |
| 0.7472222222222222 | 0 |
| 0.7479166666666667 | 0 |
| 0.748611111111111 | 0 |
| 0.7493055555555556 | 0 |
| 0.75 | 0 |
| 0.7506944444444444 | 0 |
| 0.751388888888889 | 0 |
| 0.7520833333333333 | 0 |
| 0.7527777777777778 | 0 |
| 0.7534722222222222 | 0 |
| 0.7541666666666668 | 0 |
| 0.7548611111111111 | 0 |
| 0.7555555555555555 | 0 |
| 0.75625 | 0 |
| 0.7569444444444445 | 0 |
| 0.7576388888888889 | 0 |
| 0.7583333333333333 | 0 |
| 0.7590277777777777 | 0 |
| 0.7597222222222223 | 0 |
| 0.7604166666666666 | 0 |
| 0.7611111111111111 | 0 |
| 0.7618055555555556 | 0 |
| 0.7625000000000001 | 0 |
| 0.7631944444444444 | 0 |
| 0.7638888888888888 | 0 |
| 0.7645833333333334 | 0 |
| 0.7652777777777778 | 0 |
| 0.7659722222222222 | 0 |
| 0.7666666666666666 | 0 |
| 0.7673611111111112 | 0 |
| 0.7680555555555556 | 0 |
| 0.7687499999999999 | 0 |
| 0.7694444444444444 | 0 |
| 0.7701388888888889 | 0 |
| 0.7708333333333334 | 0 |
| 0.7715277777777777 | 0 |
| 0.7722222222222223 | 0 |
| 0.7729166666666667 | 0 |
| 0.7736111111111111 | 0 |
| 0.7743055555555555 | 0 |
| 0.775 | 0 |
| 0.7756944444444445 | 0 |
| 0.7763888888888889 | 0 |
| 0.7770833333333332 | 0 |
| 0.7777777777777778 | 0 |
| 0.7784722222222222 | 0 |
| 0.7791666666666667 | 0 |
| 0.779861111111111 | 0 |
| 0.7805555555555556 | 0 |
| 0.78125 | 0 |
| 0.7819444444444444 | 0 |
| 0.782638888888889 | 0 |
| 0.7833333333333333 | 0 |
| 0.7840277777777778 | 0 |
| 0.7847222222222222 | 0 |
| 0.7854166666666668 | 0 |
| 0.7861111111111111 | 0 |
| 0.7868055555555555 | 0 |
| 0.7875 | 0 |
| 0.7881944444444445 | 0 |
| 0.7888888888888889 | 0 |
| 0.7895833333333333 | 0 |
| 0.7902777777777777 | 0 |
| 0.7909722222222223 | 0 |
| 0.7916666666666666 | 0 |
| 0.7923611111111111 | 0 |
| 0.7930555555555556 | 0 |
| 0.7937500000000001 | 0 |
| 0.7944444444444444 | 0 |
| 0.7951388888888888 | 0 |
| 0.7958333333333334 | 0 |
| 0.7965277777777778 | 0 |
| 0.7972222222222222 | 0 |
| 0.7979166666666666 | 0 |
| 0.7986111111111112 | 0 |
| 0.7993055555555556 | 0 |
| 0.7999999999999999 | 0 |
| 0.8006944444444444 | 0 |
| 0.8013888888888889 | 0 |
| 0.8020833333333334 | 0 |
| 0.8027777777777777 | 0 |
| 0.8034722222222223 | 0 |
| 0.8041666666666667 | 0 |
| 0.8048611111111111 | 0 |
| 0.8055555555555555 | 0 |
| 0.80625 | 0 |
| 0.8069444444444445 | 0 |
| 0.8076388888888889 | 0 |
| 0.8083333333333332 | 0 |
| 0.8090277777777778 | 0 |
| 0.8097222222222222 | 0 |
| 0.8104166666666667 | 0 |
| 0.811111111111111 | 0 |
| 0.8118055555555556 | 0 |
| 0.8125 | 0 |
| 0.8131944444444444 | 0 |
| 0.813888888888889 | 0 |
| 0.8145833333333333 | 0 |
| 0.8152777777777778 | 0 |
| 0.8159722222222222 | 0 |
| 0.8166666666666668 | 0 |
| 0.8173611111111111 | 0 |
| 0.8180555555555555 | 0 |
| 0.81875 | 0 |
| 0.8194444444444445 | 0 |
| 0.8201388888888889 | 0 |
| 0.8208333333333333 | 0 |
| 0.8215277777777777 | 0 |
| 0.8222222222222223 | 0 |
| 0.8229166666666666 | 0 |
| 0.8236111111111111 | 0 |
| 0.8243055555555556 | 0 |
| 0.8250000000000001 | 0 |
| 0.8256944444444444 | 0 |
| 0.8263888888888888 | 0 |
| 0.8270833333333334 | 0 |
| 0.8277777777777778 | 0 |
| 0.8284722222222222 | 0 |
| 0.8291666666666666 | 0 |
| 0.8298611111111112 | 0 |
| 0.8305555555555556 | 0 |
| 0.8312499999999999 | 0 |
| 0.8319444444444444 | 0 |
| 0.8326388888888889 | 0 |
| 0.8333333333333334 | 0 |
| 0.8340277777777777 | 0 |
| 0.8347222222222223 | 0 |
| 0.8354166666666667 | 0 |
| 0.8361111111111111 | 0 |
| 0.8368055555555555 | 0 |
| 0.8375 | 0 |
| 0.8381944444444445 | 0 |
| 0.8388888888888889 | 0 |
| 0.8395833333333332 | 0 |
| 0.8402777777777778 | 0 |
| 0.8409722222222222 | 0 |
| 0.8416666666666667 | 0 |
| 0.842361111111111 | 0 |
| 0.8430555555555556 | 0 |
| 0.84375 | 0 |
| 0.8444444444444444 | 0 |
| 0.845138888888889 | 0 |
| 0.8458333333333333 | 0 |
| 0.8465277777777778 | 0 |
| 0.8472222222222222 | 0 |
| 0.8479166666666668 | 0 |
| 0.8486111111111111 | 0 |
| 0.8493055555555555 | 0 |
| 0.85 | 0 |
| 0.8506944444444445 | 0 |
| 0.8513888888888889 | 0 |
| 0.8520833333333333 | 0 |
| 0.8527777777777777 | 0 |
| 0.8534722222222223 | 0 |
| 0.8541666666666666 | 0 |
| 0.8548611111111111 | 0 |
| 0.8555555555555556 | 0 |
| 0.8562500000000001 | 0 |
| 0.8569444444444444 | 0 |
| 0.8576388888888888 | 0 |
| 0.8583333333333334 | 0 |
| 0.8590277777777778 | 0 |
| 0.8597222222222222 | 0 |
| 0.8604166666666666 | 0 |
| 0.8611111111111112 | 0 |
| 0.8618055555555556 | 0 |
| 0.8624999999999999 | 0 |
| 0.8631944444444444 | 0 |
| 0.8638888888888889 | 0 |
| 0.8645833333333334 | 0 |
| 0.8652777777777777 | 0 |
| 0.8659722222222223 | 0 |
| 0.8666666666666667 | 0 |
| 0.8673611111111111 | 0 |
| 0.8680555555555555 | 0 |
| 0.86875 | 0 |
| 0.8694444444444445 | 0 |
| 0.8701388888888889 | 0 |
| 0.8708333333333332 | 0 |
| 0.8715277777777778 | 0 |
| 0.8722222222222222 | 0 |
| 0.8729166666666667 | 0 |
| 0.873611111111111 | 0 |
| 0.8743055555555556 | 0 |
| 0.875 | 0 |
| 0.8756944444444444 | 0 |
| 0.876388888888889 | 0 |
| 0.8770833333333333 | 0 |
| 0.8777777777777778 | 0 |
| 0.8784722222222222 | 0 |
| 0.8791666666666668 | 0 |
| 0.8798611111111111 | 0 |
| 0.8805555555555555 | 0 |
| 0.88125 | 0 |
| 0.8819444444444445 | 0 |
| 0.8826388888888889 | 0 |
| 0.8833333333333333 | 0 |
| 0.8840277777777777 | 0 |
| 0.8847222222222223 | 0 |
| 0.8854166666666666 | 0 |
| 0.8861111111111111 | 0 |
| 0.8868055555555556 | 0 |
| 0.8875000000000001 | 0 |
| 0.8881944444444444 | 0 |
| 0.8888888888888888 | 0 |
| 0.8895833333333334 | 0 |
| 0.8902777777777778 | 0 |
| 0.8909722222222222 | 0 |
| 0.8916666666666666 | 0 |
| 0.8923611111111112 | 0 |
| 0.8930555555555556 | 0 |
| 0.8937499999999999 | 0 |
| 0.8944444444444444 | 0 |
| 0.8951388888888889 | 0 |
| 0.8958333333333334 | 0 |
| 0.8965277777777777 | 0 |
| 0.8972222222222223 | 0 |
| 0.8979166666666667 | 0 |
| 0.8986111111111111 | 0 |
| 0.8993055555555555 | 0 |
| 0.9 | 0 |
| 0.9006944444444445 | 0 |
| 0.9013888888888889 | 0 |
| 0.9020833333333332 | 0 |
| 0.9027777777777778 | 0 |
| 0.9034722222222222 | 0 |
| 0.9041666666666667 | 0 |
| 0.904861111111111 | 0 |
| 0.9055555555555556 | 0 |
| 0.90625 | 0 |
| 0.9069444444444444 | 0 |
| 0.907638888888889 | 0 |
| 0.9083333333333333 | 0 |
| 0.9090277777777778 | 0 |
| 0.9097222222222222 | 0 |
| 0.9104166666666668 | 0 |
| 0.9111111111111111 | 0 |
| 0.9118055555555555 | 0 |
| 0.9125 | 0 |
| 0.9131944444444445 | 0 |
| 0.9138888888888889 | 0 |
| 0.9145833333333333 | 0 |
| 0.9152777777777777 | 0 |
| 0.9159722222222223 | 0 |
| 0.9166666666666666 | 0 |
| 0.9173611111111111 | 0 |
| 0.9180555555555556 | 0 |
| 0.9187500000000001 | 0 |
| 0.9194444444444444 | 0 |
| 0.9201388888888888 | 0 |
| 0.9208333333333334 | 0 |
| 0.9215277777777778 | 0 |
| 0.9222222222222222 | 0 |
| 0.9229166666666666 | 0 |
| 0.9236111111111112 | 0 |
| 0.9243055555555556 | 0 |
| 0.9249999999999999 | 0 |
| 0.9256944444444444 | 0 |
| 0.9263888888888889 | 0 |
| 0.9270833333333334 | 0 |
| 0.9277777777777777 | 0 |
| 0.9284722222222223 | 0 |
| 0.9291666666666667 | 0 |
| 0.9298611111111111 | 0 |
| 0.9305555555555555 | 0 |
| 0.93125 | 0 |
| 0.9319444444444445 | 0 |
| 0.9326388888888889 | 0 |
| 0.9333333333333332 | 0 |
| 0.9340277777777778 | 0 |
| 0.9347222222222222 | 0 |
| 0.9354166666666667 | 0 |
| 0.936111111111111 | 0 |
| 0.9368055555555556 | 0 |
| 0.9375 | 0 |
| 0.9381944444444444 | 0 |
| 0.938888888888889 | 0 |
| 0.9395833333333333 | 0 |
| 0.9402777777777778 | 0 |
| 0.9409722222222222 | 0 |
| 0.9416666666666668 | 0 |
| 0.9423611111111111 | 0 |
| 0.9430555555555555 | 0 |
| 0.94375 | 0 |
| 0.9444444444444445 | 0 |
| 0.9451388888888889 | 0 |
| 0.9458333333333333 | 0 |
| 0.9465277777777777 | 0 |
| 0.9472222222222223 | 0 |
| 0.9479166666666666 | 0 |
| 0.9486111111111111 | 0 |
| 0.9493055555555556 | 0 |
| 0.9500000000000001 | 0 |
| 0.9506944444444444 | 0 |
| 0.9513888888888888 | 0 |
| 0.9520833333333334 | 0 |
| 0.9527777777777778 | 0 |
| 0.9534722222222222 | 0 |
| 0.9541666666666666 | 0 |
| 0.9548611111111112 | 0 |
| 0.9555555555555556 | 0 |
| 0.9562499999999999 | 0 |
| 0.9569444444444444 | 0 |
| 0.9576388888888889 | 0 |
| 0.9583333333333334 | 0 |
| 0.9590277777777777 | 0 |
| 0.9597222222222223 | 0 |
| 0.9604166666666667 | 0 |
| 0.9611111111111111 | 0 |
| 0.9618055555555555 | 0 |
| 0.9625 | 0 |
| 0.9631944444444445 | 0 |
| 0.9638888888888889 | 0 |
| 0.9645833333333332 | 0 |
| 0.9652777777777778 | 0 |
| 0.9659722222222222 | 0 |
| 0.9666666666666667 | 0 |
| 0.967361111111111 | 0 |
| 0.9680555555555556 | 0 |
| 0.96875 | 0 |
| 0.9694444444444444 | 0 |
| 0.970138888888889 | 0 |
| 0.9708333333333333 | 0 |
| 0.9715277777777778 | 0 |
| 0.9722222222222222 | 0 |
| 0.9729166666666668 | 0 |
| 0.9736111111111111 | 0 |
| 0.9743055555555555 | 0 |
| 0.975 | 0 |
| 0.9756944444444445 | 0 |
| 0.9763888888888889 | 0 |
| 0.9770833333333333 | 0 |
| 0.9777777777777777 | 0 |
| 0.9784722222222223 | 0 |
| 0.9791666666666666 | 0 |
| 0.9798611111111111 | 0 |
| 0.9805555555555556 | 0 |
| 0.9812500000000001 | 0 |
| 0.9819444444444444 | 0 |
| 0.9826388888888888 | 0 |
| 0.9833333333333334 | 0 |
| 0.9840277777777778 | 0 |
| 0.9847222222222222 | 0 |
| 0.9854166666666666 | 0 |
| 0.9861111111111112 | 0 |
| 0.9868055555555556 | 0 |
| 0.9874999999999999 | 0 |
| 0.9881944444444444 | 0 |
| 0.9888888888888889 | 0 |
| 0.9895833333333334 | 0 |
| 0.9902777777777777 | 0 |
| 0.9909722222222223 | 0 |
| 0.9916666666666667 | 0 |
| 0.9923611111111111 | 0 |
| 0.9930555555555555 | 0 |
| 0.99375 | 0 |
| 0.9944444444444445 | 0 |
| 0.9951388888888889 | 0 |
| 0.9958333333333332 | 0 |
| 0.9965277777777778 | 0 |
| 0.9972222222222222 | 0 |
| 0.9979166666666667 | 0 |
| 0.998611111111111 | 0 |
| 0.9993055555555556 | 0 |